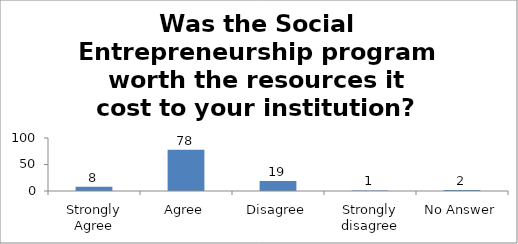
| Category | Was the Social Entrepreneurship program worth the resources it cost to your institution? |
|---|---|
| Strongly Agree | 8 |
| Agree | 78 |
| Disagree | 19 |
| Strongly disagree | 1 |
| No Answer | 2 |